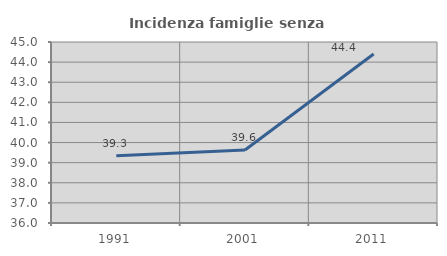
| Category | Incidenza famiglie senza nuclei |
|---|---|
| 1991.0 | 39.339 |
| 2001.0 | 39.626 |
| 2011.0 | 44.4 |